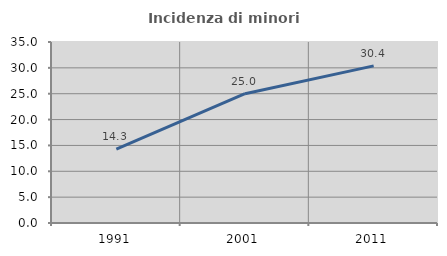
| Category | Incidenza di minori stranieri |
|---|---|
| 1991.0 | 14.286 |
| 2001.0 | 25 |
| 2011.0 | 30.387 |